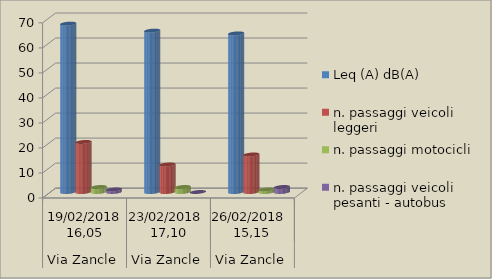
| Category | Leq (A) dB(A) | n. passaggi veicoli leggeri  | n. passaggi motocicli | n. passaggi veicoli pesanti - autobus  |
|---|---|---|---|---|
| 0 | 67.3 | 20 | 2 | 1 |
| 1 | 64.5 | 11 | 2 | 0 |
| 2 | 63.4 | 15 | 1 | 2 |